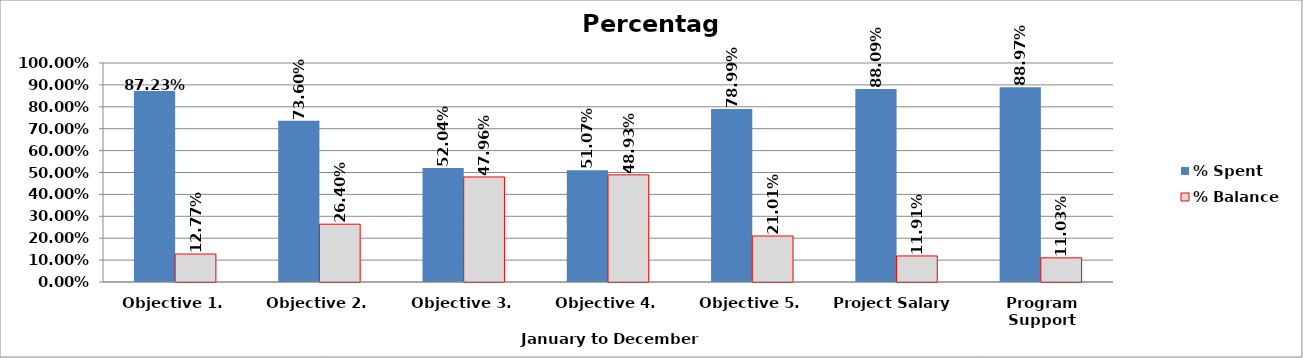
| Category | % Spent  | % Balance  |
|---|---|---|
| Objective 1. | 0.872 | 0.128 |
| Objective 2. | 0.736 | 0.264 |
| Objective 3. | 0.52 | 0.48 |
| Objective 4. | 0.511 | 0.489 |
| Objective 5. | 0.79 | 0.21 |
| Project Salary  | 0.881 | 0.119 |
| Program Support | 0.89 | 0.11 |